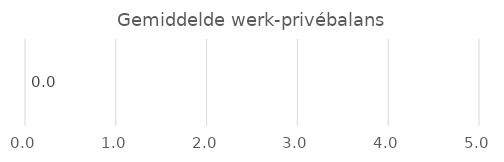
| Category | Series 0 |
|---|---|
| Werk-privé balans | 0 |